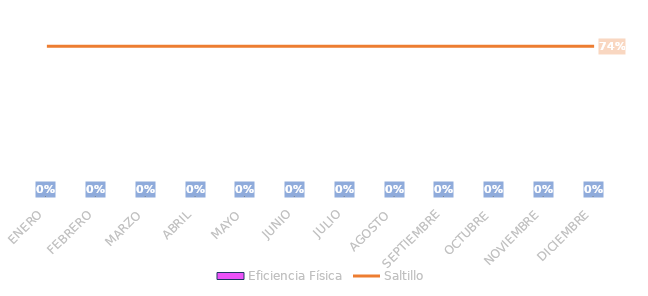
| Category | Eficiencia Física |
|---|---|
| ENERO | 0 |
| FEBRERO | 0 |
| MARZO | 0 |
| ABRIL | 0 |
| MAYO | 0 |
| JUNIO | 0 |
| JULIO | 0 |
| AGOSTO | 0 |
| SEPTIEMBRE | 0 |
| OCTUBRE | 0 |
| NOVIEMBRE | 0 |
| DICIEMBRE | 0 |